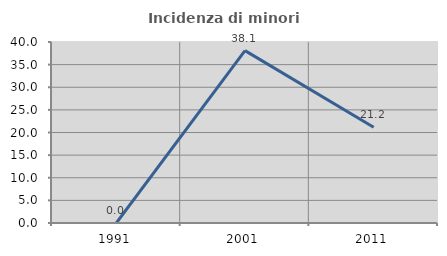
| Category | Incidenza di minori stranieri |
|---|---|
| 1991.0 | 0 |
| 2001.0 | 38.095 |
| 2011.0 | 21.154 |